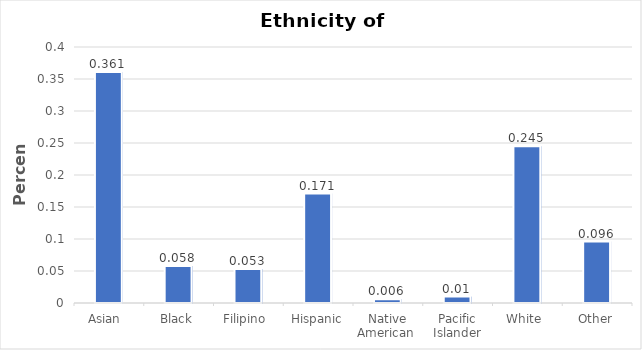
| Category | Series 0 |
|---|---|
| Asian  | 0.361 |
| Black | 0.058 |
| Filipino  | 0.053 |
| Hispanic | 0.171 |
| Native American  | 0.006 |
| Pacific Islander | 0.01 |
| White  | 0.245 |
| Other | 0.096 |